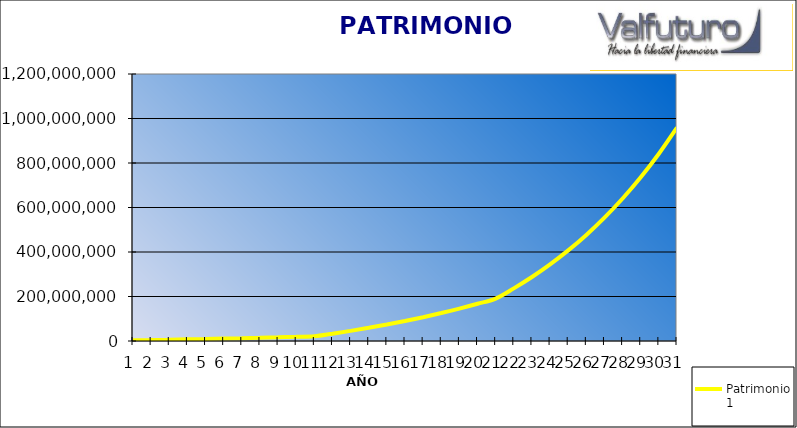
| Category | Patrimonio 1 |
|---|---|
| 0 | 3000000 |
| 1 | 4380000 |
| 2 | 5842800 |
| 3 | 7393368 |
| 4 | 9036970.08 |
| 5 | 10779188.285 |
| 6 | 12625939.582 |
| 7 | 14583495.957 |
| 8 | 16658505.714 |
| 9 | 18858016.057 |
| 10 | 21189497.02 |
| 11 | 32884656.782 |
| 12 | 45515429.325 |
| 13 | 59156663.671 |
| 14 | 73889196.764 |
| 15 | 89800332.505 |
| 16 | 106984359.106 |
| 17 | 125543107.834 |
| 18 | 145586556.461 |
| 19 | 167233480.978 |
| 20 | 190612159.456 |
| 21 | 236579496.996 |
| 22 | 287603241.666 |
| 23 | 344239598.249 |
| 24 | 407105954.057 |
| 25 | 476887609.003 |
| 26 | 554345245.993 |
| 27 | 640323223.053 |
| 28 | 735758777.588 |
| 29 | 841692243.123 |
| 30 | 959278389.867 |